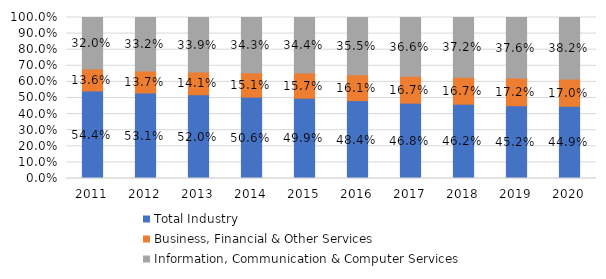
| Category | Total Industry | Business, Financial & Other Services | Information, Communication & Computer Services |
|---|---|---|---|
| 2011.0 | 0.544 | 0.136 | 0.32 |
| 2012.0 | 0.531 | 0.137 | 0.332 |
| 2013.0 | 0.52 | 0.141 | 0.339 |
| 2014.0 | 0.506 | 0.151 | 0.343 |
| 2015.0 | 0.499 | 0.157 | 0.344 |
| 2016.0 | 0.484 | 0.161 | 0.355 |
| 2017.0 | 0.468 | 0.167 | 0.366 |
| 2018.0 | 0.462 | 0.167 | 0.372 |
| 2019.0 | 0.452 | 0.172 | 0.376 |
| 2020.0 | 0.449 | 0.17 | 0.382 |